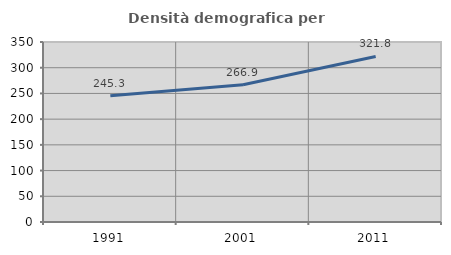
| Category | Densità demografica |
|---|---|
| 1991.0 | 245.295 |
| 2001.0 | 266.871 |
| 2011.0 | 321.826 |